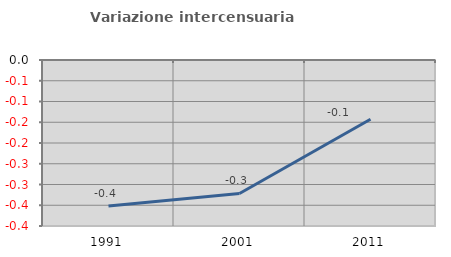
| Category | Variazione intercensuaria annua |
|---|---|
| 1991.0 | -0.352 |
| 2001.0 | -0.322 |
| 2011.0 | -0.143 |